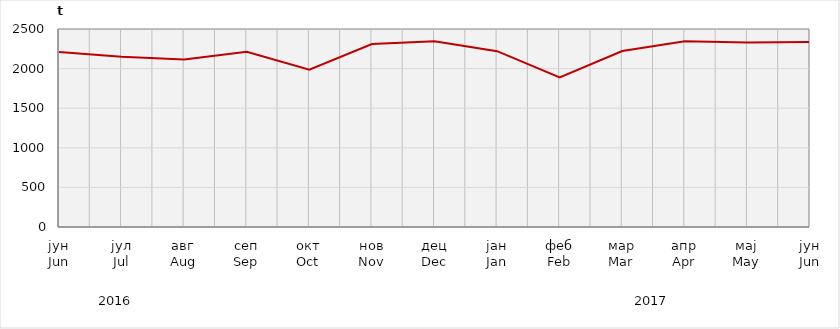
| Category | Нето тежина заклане стоке                              Net weight of  slaughtered livestock |
|---|---|
| јун
Jun | 2210576.92 |
| јул
Jul | 2148617 |
| авг
Aug | 2114109.78 |
| сеп
Sep | 2211725.58 |
| окт
Oct | 1985741.43 |
| нов
Nov | 2309850.52 |
| дец
Dec | 2344927.28 |
| јан
Jan | 2220030.9 |
| феб
Feb | 1890056.65 |
| мар
Mar | 2221281.4 |
| апр
Apr | 2344899.97 |
| мај
May | 2330965.85 |
| јун
Jun | 2337255.83 |